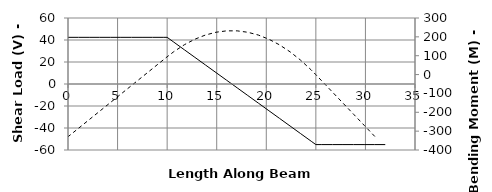
| Category | V |
|---|---|
| 0.0 | 42.417 |
| 0.0 | 42.417 |
| 0.0 | 42.417 |
| 1.0666666666666667 | 42.417 |
| 2.1333333333333333 | 42.417 |
| 3.2 | 42.417 |
| 4.266666666666667 | 42.417 |
| 5.333333333333333 | 42.417 |
| 6.4 | 42.417 |
| 7.466666666666667 | 42.417 |
| 8.533333333333333 | 42.417 |
| 9.6 | 42.417 |
| 10.0 | 42.417 |
| 10.666666666666666 | 38.083 |
| 11.733333333333333 | 31.15 |
| 12.8 | 24.217 |
| 13.866666666666667 | 17.283 |
| 14.933333333333334 | 10.35 |
| 16.0 | 3.417 |
| 17.066666666666666 | -3.517 |
| 18.133333333333333 | -10.45 |
| 19.2 | -17.383 |
| 20.266666666666666 | -24.317 |
| 21.333333333333332 | -31.25 |
| 22.4 | -38.183 |
| 23.466666666666665 | -45.117 |
| 24.53333333333333 | -52.05 |
| 25.0 | -55.083 |
| 25.6 | -55.083 |
| 26.666666666666668 | -55.083 |
| 27.733333333333334 | -55.083 |
| 28.8 | -55.083 |
| 29.866666666666667 | -55.083 |
| 30.933333333333334 | -55.083 |
| 32.0 | -55.083 |